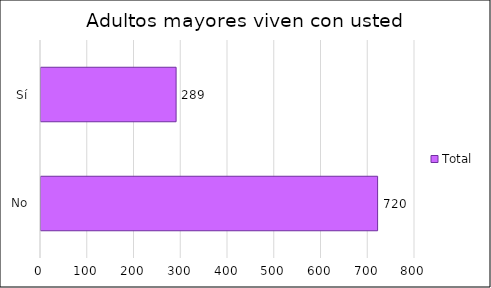
| Category | Total |
|---|---|
| No | 720 |
| Sí | 289 |